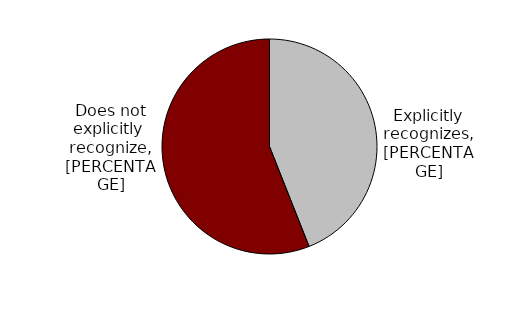
| Category | Series 0 |
|---|---|
| Explicitly recognizes | 0.44 |
| Does not explicitly recognize | 0.56 |